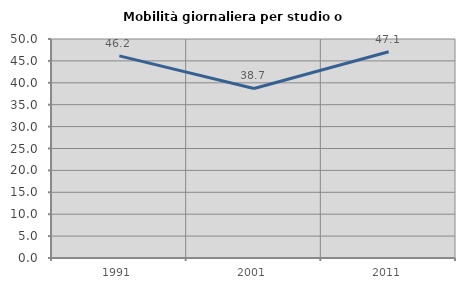
| Category | Mobilità giornaliera per studio o lavoro |
|---|---|
| 1991.0 | 46.154 |
| 2001.0 | 38.71 |
| 2011.0 | 47.093 |